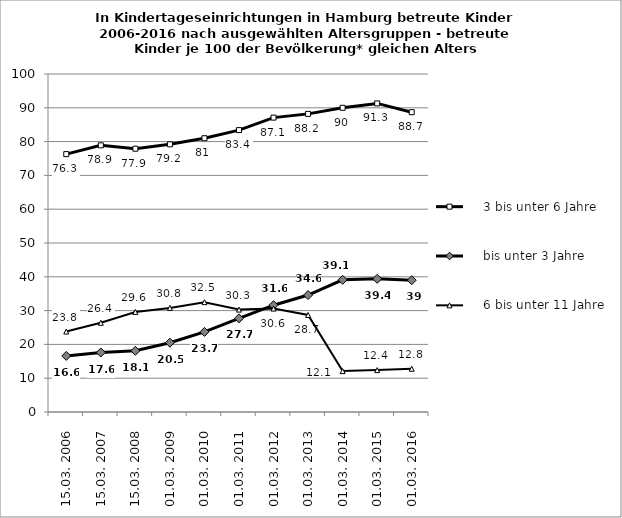
| Category |     3 bis unter 6 Jahre |     bis unter 3 Jahre |     6 bis unter 11 Jahre |
|---|---|---|---|
| 15.03. 2006 | 76.3 | 16.6 | 23.8 |
| 15.03. 2007 | 78.9 | 17.6 | 26.4 |
| 15.03. 2008 | 77.9 | 18.1 | 29.6 |
| 01.03. 2009 | 79.2 | 20.5 | 30.8 |
| 01.03. 2010 | 81 | 23.7 | 32.5 |
| 01.03. 2011 | 83.4 | 27.7 | 30.3 |
| 01.03. 2012 | 87.1 | 31.6 | 30.6 |
| 01.03. 2013 | 88.2 | 34.6 | 28.7 |
| 01.03. 2014 | 90 | 39.1 | 12.1 |
| 01.03. 2015 | 91.3 | 39.4 | 12.4 |
| 01.03. 2016 | 88.7 | 39 | 12.8 |